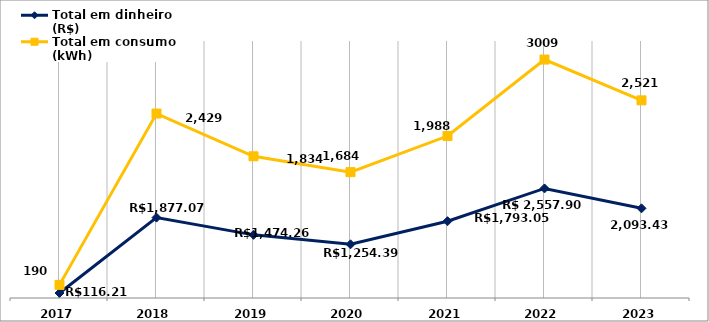
| Category | Total em dinheiro (R$) | Total em consumo (kWh) |
|---|---|---|
| 2017.0 | 116.21 | 190 |
| 2018.0 | 1877.07 | 2429 |
| 2019.0 | 1474.26 | 1834 |
| 2020.0 | 1254.39 | 1684 |
| 2021.0 | 1793.05 | 1988 |
| 2022.0 | 2557.9 | 3009 |
| 2023.0 | 2093.43 | 2521 |